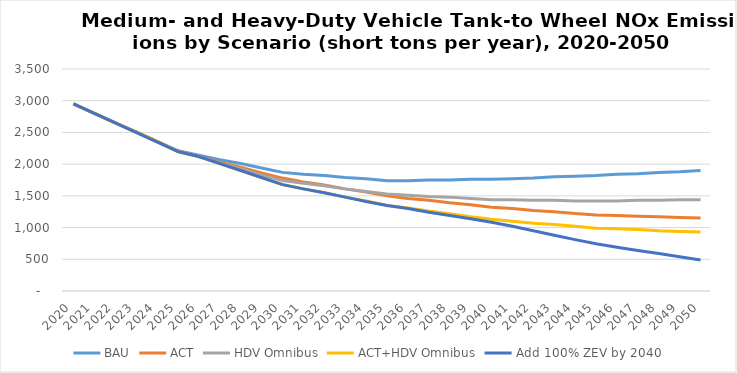
| Category | BAU | ACT | HDV Omnibus | ACT+HDV Omnibus | Add 100% ZEV by 2040 |
|---|---|---|---|---|---|
| 2020.0 | 2950 | 2950 | 2950 | 2950 | 2949.268 |
| 2021.0 | 2800 | 2800 | 2800 | 2800 | 2800 |
| 2022.0 | 2650 | 2650 | 2650 | 2650 | 2650 |
| 2023.0 | 2510 | 2500 | 2510 | 2510 | 2500 |
| 2024.0 | 2360 | 2350 | 2360 | 2360 | 2350 |
| 2025.0 | 2210 | 2200 | 2210 | 2200 | 2199.933 |
| 2026.0 | 2140 | 2120 | 2120 | 2120 | 2120 |
| 2027.0 | 2070 | 2030 | 2020 | 2010 | 2010 |
| 2028.0 | 2010 | 1950 | 1930 | 1900 | 1900 |
| 2029.0 | 1940 | 1860 | 1830 | 1790 | 1790 |
| 2030.0 | 1870 | 1780 | 1740 | 1680 | 1676.323 |
| 2031.0 | 1840 | 1720 | 1700 | 1610 | 1610 |
| 2032.0 | 1820 | 1670 | 1660 | 1550 | 1550 |
| 2033.0 | 1790 | 1610 | 1610 | 1480 | 1480 |
| 2034.0 | 1770 | 1560 | 1570 | 1420 | 1410 |
| 2035.0 | 1740 | 1500 | 1530 | 1350 | 1348.429 |
| 2036.0 | 1740 | 1460 | 1510 | 1310 | 1300 |
| 2037.0 | 1750 | 1430 | 1490 | 1260 | 1240 |
| 2038.0 | 1750 | 1390 | 1480 | 1220 | 1190 |
| 2039.0 | 1760 | 1360 | 1460 | 1170 | 1140 |
| 2040.0 | 1760 | 1320 | 1440 | 1130 | 1082.915 |
| 2041.0 | 1770 | 1300 | 1440 | 1100 | 1020 |
| 2042.0 | 1780 | 1270 | 1430 | 1070 | 950 |
| 2043.0 | 1800 | 1250 | 1430 | 1050 | 880 |
| 2044.0 | 1810 | 1220 | 1420 | 1020 | 810 |
| 2045.0 | 1820 | 1200 | 1420 | 990 | 745.486 |
| 2046.0 | 1840 | 1190 | 1420 | 980 | 690 |
| 2047.0 | 1850 | 1180 | 1430 | 970 | 640 |
| 2048.0 | 1870 | 1170 | 1430 | 950 | 590 |
| 2049.0 | 1880 | 1160 | 1440 | 940 | 540 |
| 2050.0 | 1900 | 1150 | 1440 | 930 | 487.417 |